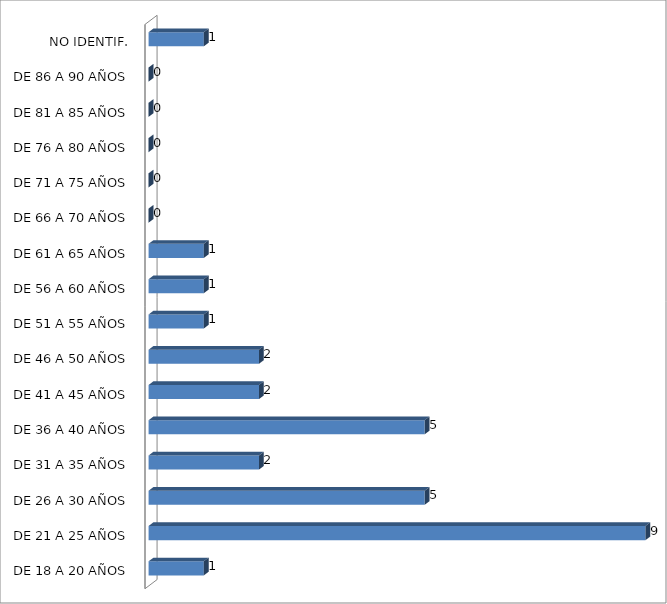
| Category | ESTADO  DE EBRIEDAD |
|---|---|
| DE 18 A 20 AÑOS | 1 |
| DE 21 A 25 AÑOS | 9 |
| DE 26 A 30 AÑOS | 5 |
| DE 31 A 35 AÑOS | 2 |
| DE 36 A 40 AÑOS | 5 |
| DE 41 A 45 AÑOS | 2 |
| DE 46 A 50 AÑOS | 2 |
| DE 51 A 55 AÑOS | 1 |
| DE 56 A 60 AÑOS | 1 |
| DE 61 A 65 AÑOS | 1 |
| DE 66 A 70 AÑOS | 0 |
| DE 71 A 75 AÑOS | 0 |
| DE 76 A 80 AÑOS | 0 |
| DE 81 A 85 AÑOS | 0 |
| DE 86 A 90 AÑOS | 0 |
| NO IDENTIF. | 1 |